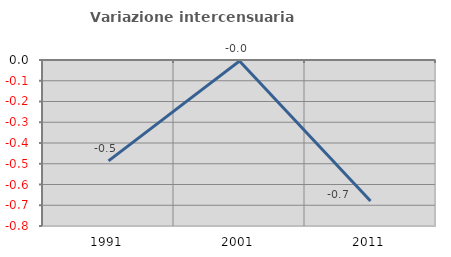
| Category | Variazione intercensuaria annua |
|---|---|
| 1991.0 | -0.486 |
| 2001.0 | -0.005 |
| 2011.0 | -0.68 |